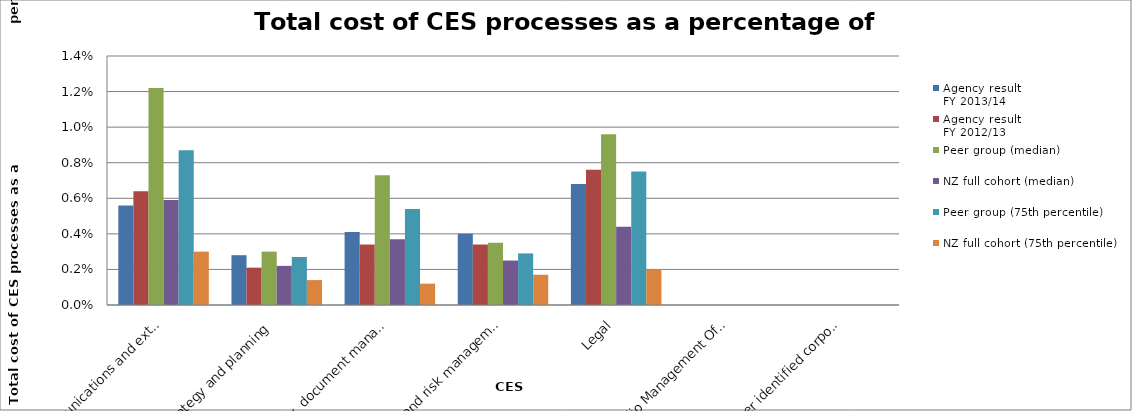
| Category | Agency result
FY 2013/14 | Agency result
FY 2012/13 | Peer group (median) | NZ full cohort (median) | Peer group (75th percentile) | NZ full cohort (75th percentile) |
|---|---|---|---|---|---|---|
| Communications and external relations (excluding the publications function) | 0.006 | 0.006 | 0.012 | 0.006 | 0.009 | 0.003 |
| Strategy and planning | 0.003 | 0.002 | 0.003 | 0.002 | 0.003 | 0.001 |
| Library, document management, archive and research | 0.004 | 0.003 | 0.007 | 0.004 | 0.005 | 0.001 |
| Audit and risk management | 0.004 | 0.003 | 0.004 | 0.002 | 0.003 | 0.002 |
| Legal | 0.007 | 0.008 | 0.01 | 0.004 | 0.008 | 0.002 |
| Portfolio Management Office | 0 | 0 | 0 | 0 | 0 | 0 |
| All other identified corporate costs | 0 | 0 | 0 | 0 | 0 | 0 |